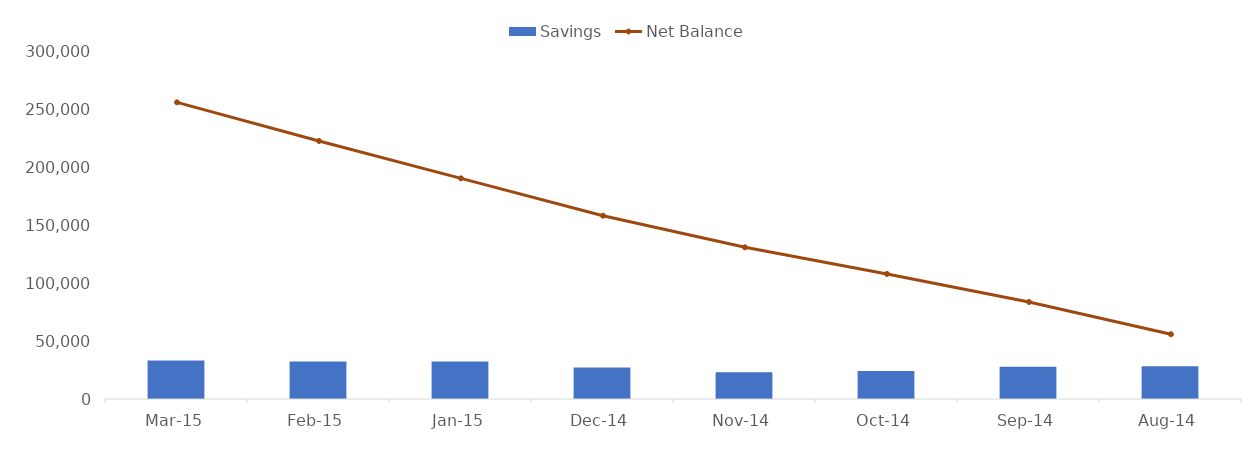
| Category | Savings |
|---|---|
| Mar-15 | 33380 |
| Feb-15 | 32320 |
| Jan-15 | 32320 |
| Dec-14 | 27330 |
| Nov-14 | 23025 |
| Oct-14 | 24250 |
| Sep-14 | 27875 |
| Aug-14 | 28280 |